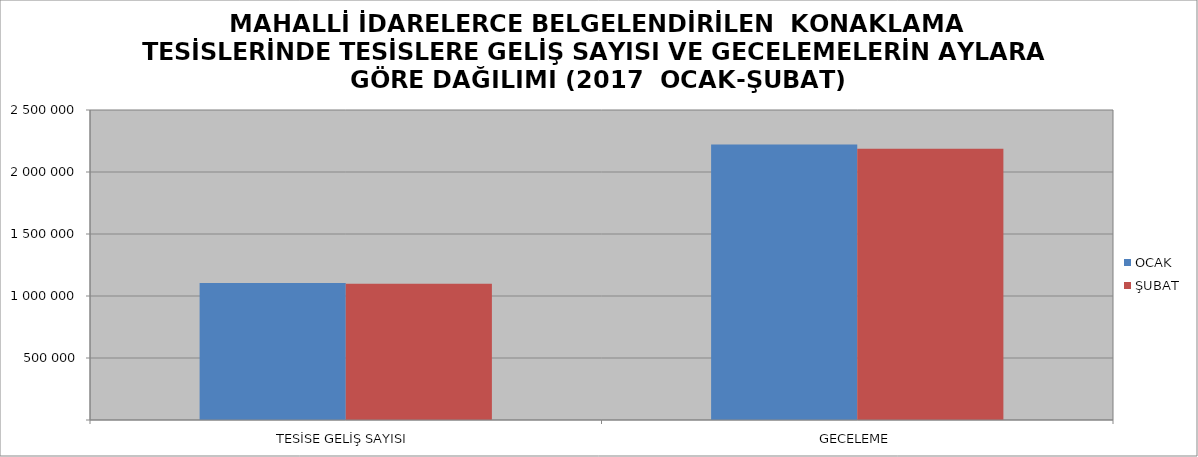
| Category | OCAK | ŞUBAT |
|---|---|---|
| TESİSE GELİŞ SAYISI | 1104649 | 1099366 |
| GECELEME | 2222261 | 2187982 |